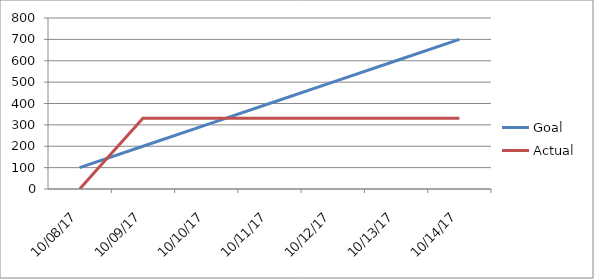
| Category | Goal | Actual |
|---|---|---|
| 2017-10-08 | 100 | 0 |
| 2017-10-09 | 200 | 331 |
| 2017-10-10 | 300 | 331 |
| 2017-10-11 | 400 | 331 |
| 2017-10-12 | 500 | 331 |
| 2017-10-13 | 600 | 331 |
| 2017-10-14 | 700 | 331 |